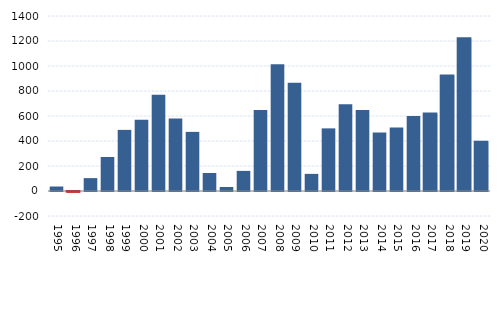
| Category | Saldo migratório |
|---|---|
| 1995.0 | 36 |
| 1996.0 | -4 |
| 1997.0 | 103 |
| 1998.0 | 272 |
| 1999.0 | 489 |
| 2000.0 | 570 |
| 2001.0 | 771 |
| 2002.0 | 581 |
| 2003.0 | 473 |
| 2004.0 | 144 |
| 2005.0 | 32 |
| 2006.0 | 161 |
| 2007.0 | 649 |
| 2008.0 | 1015 |
| 2009.0 | 866 |
| 2010.0 | 137 |
| 2011.0 | 501 |
| 2012.0 | 694 |
| 2013.0 | 648 |
| 2014.0 | 468 |
| 2015.0 | 509 |
| 2016.0 | 601 |
| 2017.0 | 620 |
| 2018.0 | 924 |
| 2019.0 | 1222 |
| 2020.0 | 394 |